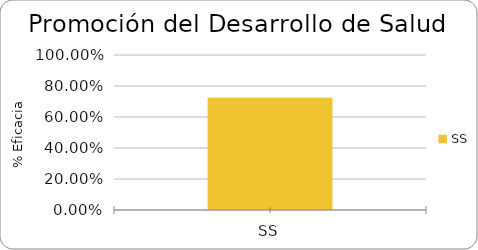
| Category | % Eficacia total |
|---|---|
| SS | 0.724 |